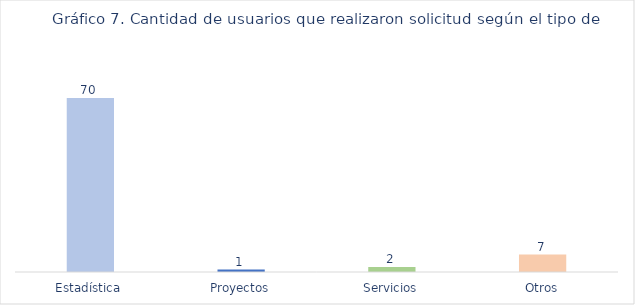
| Category | Cantidad |
|---|---|
| Estadística | 70 |
| Proyectos | 1 |
| Servicios | 2 |
| Otros | 7 |